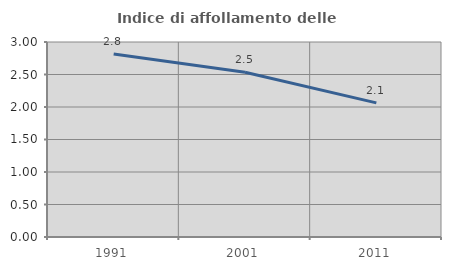
| Category | Indice di affollamento delle abitazioni  |
|---|---|
| 1991.0 | 2.814 |
| 2001.0 | 2.535 |
| 2011.0 | 2.064 |